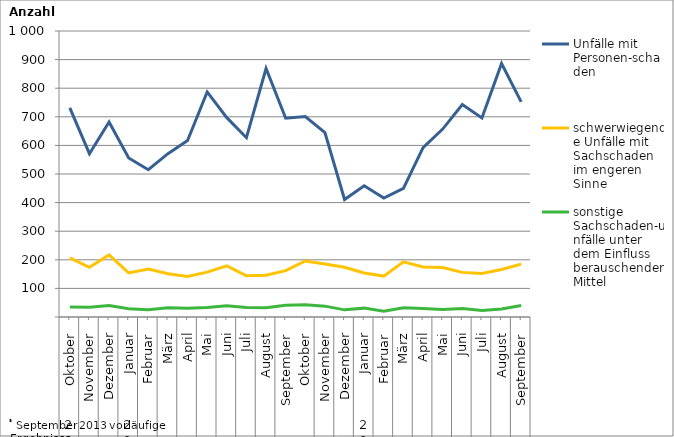
| Category | Unfälle mit Personen-schaden | schwerwiegende Unfälle mit Sachschaden   im engeren Sinne | sonstige Sachschaden-unfälle unter dem Einfluss berauschender Mittel |
|---|---|---|---|
| 0 | 731 | 207 | 35 |
| 1 | 571 | 174 | 34 |
| 2 | 682 | 217 | 40 |
| 3 | 556 | 154 | 29 |
| 4 | 515 | 168 | 25 |
| 5 | 571 | 151 | 32 |
| 6 | 617 | 142 | 31 |
| 7 | 787 | 157 | 33 |
| 8 | 697 | 179 | 39 |
| 9 | 627 | 144 | 33 |
| 10 | 869 | 146 | 32 |
| 11 | 695 | 162 | 41 |
| 12 | 701 | 196 | 43 |
| 13 | 645 | 185 | 38 |
| 14 | 411 | 174 | 25 |
| 15 | 459 | 154 | 31 |
| 16 | 416 | 143 | 20 |
| 17 | 450 | 193 | 32 |
| 18 | 592 | 175 | 30 |
| 19 | 657 | 173 | 26 |
| 20 | 743 | 156 | 30 |
| 21 | 696 | 152 | 23 |
| 22 | 886 | 166 | 28 |
| 23 | 752 | 185 | 40 |